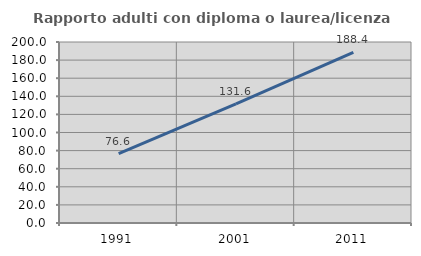
| Category | Rapporto adulti con diploma o laurea/licenza media  |
|---|---|
| 1991.0 | 76.572 |
| 2001.0 | 131.575 |
| 2011.0 | 188.436 |